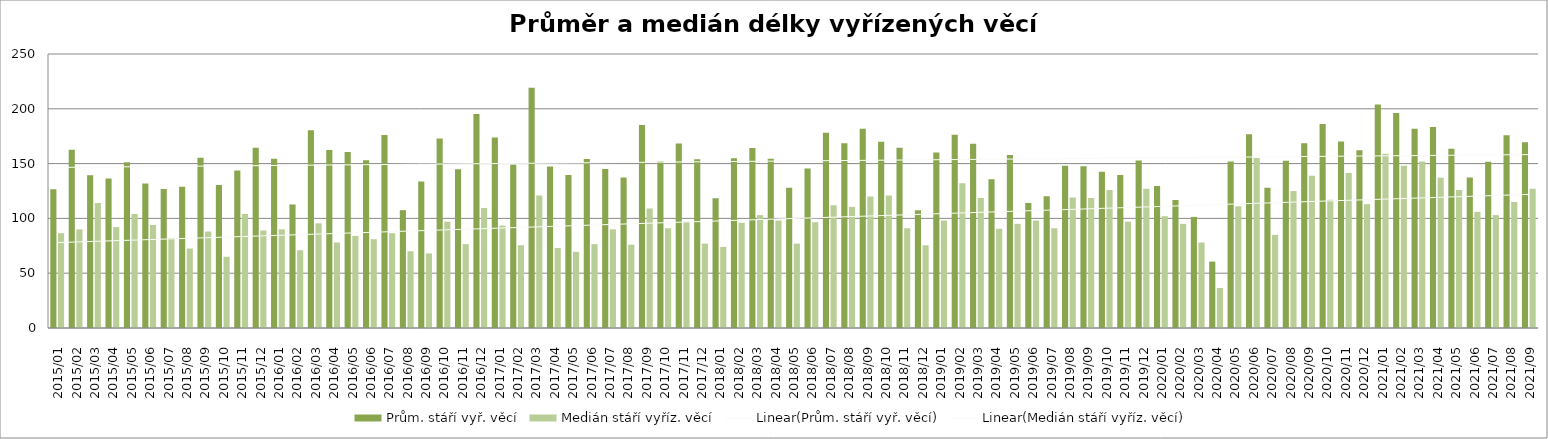
| Category | Prům. stáří vyř. věcí | Medián stáří vyříz. věcí |
|---|---|---|
| 2015/01 | 126.71 | 86.5 |
| 2015/02 | 162.55 | 90 |
| 2015/03 | 139.31 | 114 |
| 2015/04 | 136.49 | 92 |
| 2015/05 | 151.17 | 104 |
| 2015/06 | 131.83 | 94 |
| 2015/07 | 126.78 | 82 |
| 2015/08 | 128.81 | 72.5 |
| 2015/09 | 155.23 | 88 |
| 2015/10 | 130.56 | 65 |
| 2015/11 | 143.65 | 104 |
| 2015/12 | 164.42 | 89 |
| 2016/01 | 154.5 | 90 |
| 2016/02 | 112.71 | 71 |
| 2016/03 | 180.45 | 95.5 |
| 2016/04 | 162.31 | 78 |
| 2016/05 | 160.52 | 84 |
| 2016/06 | 153.16 | 81 |
| 2016/07 | 176.07 | 86.5 |
| 2016/08 | 107.52 | 70 |
| 2016/09 | 133.69 | 68 |
| 2016/10 | 172.97 | 97 |
| 2016/11 | 144.85 | 76.5 |
| 2016/12 | 195.31 | 109.5 |
| 2017/01 | 173.71 | 93.5 |
| 2017/02 | 148.95 | 75.5 |
| 2017/03 | 219.29 | 121 |
| 2017/04 | 147.39 | 73 |
| 2017/05 | 139.5 | 69.5 |
| 2017/06 | 154.1 | 76.5 |
| 2017/07 | 145.18 | 90 |
| 2017/08 | 137.21 | 76 |
| 2017/09 | 185.32 | 109 |
| 2017/10 | 151.94 | 91 |
| 2017/11 | 168.35 | 97 |
| 2017/12 | 154 | 77 |
| 2018/01 | 118.33 | 74 |
| 2018/02 | 154.97 | 96 |
| 2018/03 | 164.33 | 103 |
| 2018/04 | 154.42 | 98 |
| 2018/05 | 127.86 | 77 |
| 2018/06 | 145.63 | 96.5 |
| 2018/07 | 178.21 | 112 |
| 2018/08 | 168.47 | 110.5 |
| 2018/09 | 181.7 | 120 |
| 2018/10 | 169.83 | 121 |
| 2018/11 | 164.44 | 91 |
| 2018/12 | 107.42 | 75.5 |
| 2019/01 | 160.12 | 98 |
| 2019/02 | 176.43 | 132 |
| 2019/03 | 168.19 | 118.5 |
| 2019/04 | 135.61 | 90.5 |
| 2019/05 | 157.81 | 95 |
| 2019/06 | 114.11 | 98 |
| 2019/07 | 120.16 | 91 |
| 2019/08 | 147.97 | 119 |
| 2019/09 | 147.64 | 118.5 |
| 2019/10 | 142.54 | 126 |
| 2019/11 | 139.69 | 97 |
| 2019/12 | 152.81 | 127 |
| 2020/01 | 129.46 | 102 |
| 2020/02 | 116.89 | 95 |
| 2020/03 | 101.34 | 78 |
| 2020/04 | 60.56 | 36.5 |
| 2020/05 | 151.88 | 111 |
| 2020/06 | 176.67 | 155 |
| 2020/07 | 127.96 | 85 |
| 2020/08 | 152.56 | 125 |
| 2020/09 | 168.58 | 139 |
| 2020/10 | 186.06 | 117 |
| 2020/11 | 170.06 | 141.5 |
| 2020/12 | 162.16 | 113 |
| 2021/01 | 203.98 | 159 |
| 2021/02 | 196.26 | 148 |
| 2021/03 | 181.79 | 152 |
| 2021/04 | 183.36 | 137 |
| 2021/05 | 163.61 | 126 |
| 2021/06 | 137.35 | 106 |
| 2021/07 | 151.76 | 103 |
| 2021/08 | 175.93 | 115 |
| 2021/09 | 169.5 | 127 |